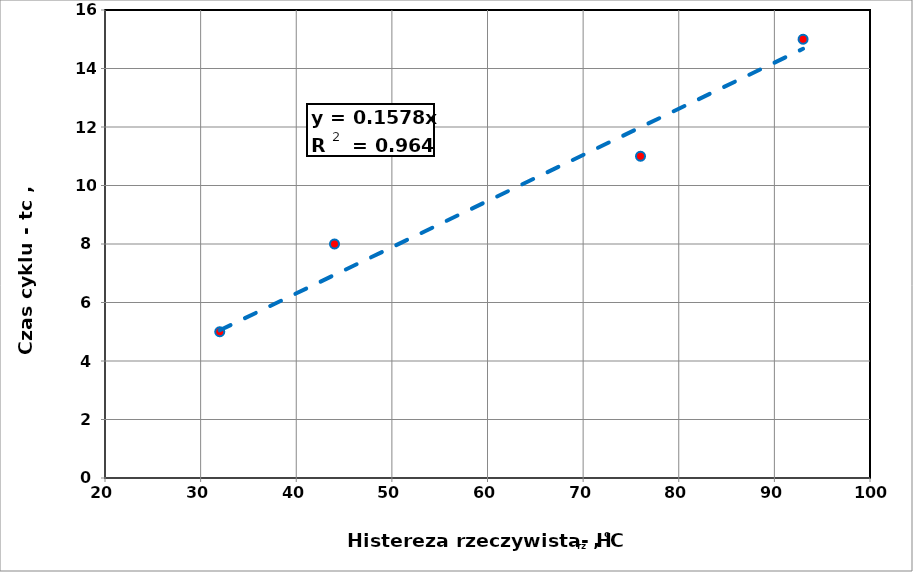
| Category | Series 0 |
|---|---|
| 93.0 | 15 |
| 76.0 | 11 |
| 44.0 | 8 |
| 32.0 | 5 |